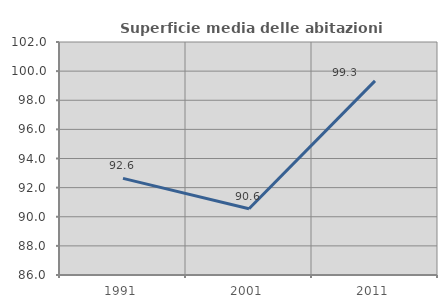
| Category | Superficie media delle abitazioni occupate |
|---|---|
| 1991.0 | 92.635 |
| 2001.0 | 90.553 |
| 2011.0 | 99.334 |